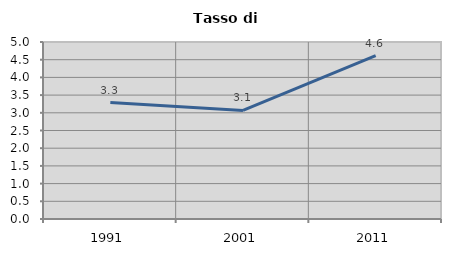
| Category | Tasso di disoccupazione   |
|---|---|
| 1991.0 | 3.291 |
| 2001.0 | 3.067 |
| 2011.0 | 4.614 |